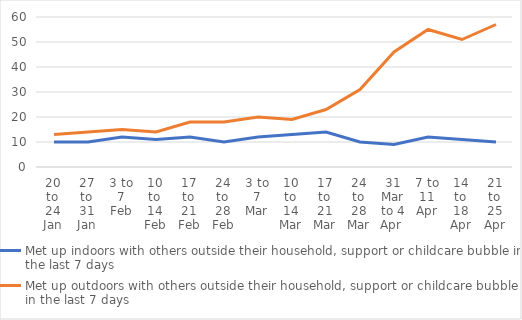
| Category | Met up indoors with others outside their household, support or childcare bubble in the last 7 days | Met up outdoors with others outside their household, support or childcare bubble in the last 7 days |
|---|---|---|
| 20 to 24 Jan | 10 | 13 |
| 27 to 31 Jan | 10 | 14 |
| 3 to 7 Feb | 12 | 15 |
| 10 to 14 Feb | 11 | 14 |
| 17 to 21 Feb | 12 | 18 |
| 24 to 28 Feb | 10 | 18 |
| 3 to 7 Mar | 12 | 20 |
| 10 to 14 Mar | 13 | 19 |
| 17 to 21 Mar | 14 | 23 |
| 24 to 28 Mar | 10 | 31 |
| 31 Mar to 4 Apr  | 9 | 46 |
| 7 to 11 Apr | 12 | 55 |
| 14 to 18 Apr | 11 | 51 |
| 21 to 25 Apr | 10 | 57 |